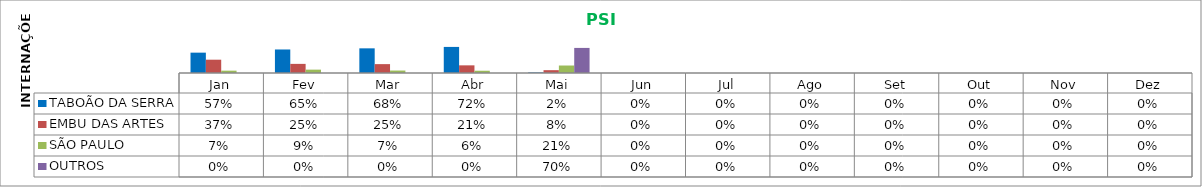
| Category | TABOÃO DA SERRA | EMBU DAS ARTES | SÃO PAULO | OUTROS |
|---|---|---|---|---|
| Jan | 0.565 | 0.37 | 0.065 | 0 |
| Fev | 0.653 | 0.253 | 0.093 | 0 |
| Mar | 0.685 | 0.247 | 0.068 | 0 |
| Abr | 0.724 | 0.213 | 0.063 | 0 |
| Mai | 0.017 | 0.079 | 0.208 | 0.697 |
| Jun | 0 | 0 | 0 | 0 |
| Jul | 0 | 0 | 0 | 0 |
| Ago | 0 | 0 | 0 | 0 |
| Set | 0 | 0 | 0 | 0 |
| Out | 0 | 0 | 0 | 0 |
| Nov | 0 | 0 | 0 | 0 |
| Dez | 0 | 0 | 0 | 0 |